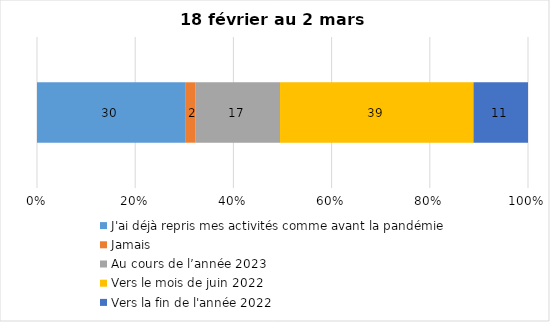
| Category | J'ai déjà repris mes activités comme avant la pandémie | Jamais | Au cours de l’année 2023 | Vers le mois de juin 2022 | Vers la fin de l'année 2022 |
|---|---|---|---|---|---|
| 0 | 30 | 2 | 17 | 39 | 11 |